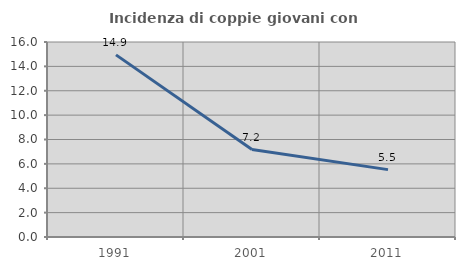
| Category | Incidenza di coppie giovani con figli |
|---|---|
| 1991.0 | 14.943 |
| 2001.0 | 7.171 |
| 2011.0 | 5.528 |